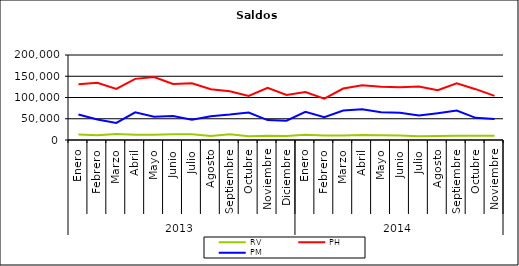
| Category | RV | PH | PM |
|---|---|---|---|
| 0 | 12966.437 | 131380.856 | 59975.653 |
| 1 | 11432.271 | 134655.891 | 48046.612 |
| 2 | 14149.543 | 120343.782 | 40297.909 |
| 3 | 12403.249 | 143830.507 | 64946.114 |
| 4 | 12323.134 | 148139.781 | 54592.514 |
| 5 | 13759.976 | 131634.752 | 56652.701 |
| 6 | 13256.014 | 133515.147 | 47907.561 |
| 7 | 9335.8 | 119600.732 | 55860.576 |
| 8 | 13362.811 | 114843.232 | 59771.51 |
| 9 | 9080.978 | 103607.627 | 64696.186 |
| 10 | 9993.913 | 122533.872 | 46801.148 |
| 11 | 9303.464 | 105747.395 | 45455.331 |
| 12 | 12145.055 | 112918.262 | 66200.17 |
| 13 | 10742.048 | 97242.789 | 53817.215 |
| 14 | 10795.854 | 121097.504 | 69409.543 |
| 15 | 11604.091 | 128798.176 | 72161.549 |
| 16 | 11264.83 | 125268.689 | 65570.493 |
| 17 | 10724.052 | 123922.82 | 64054.99 |
| 18 | 9051.652 | 126086.706 | 57402.892 |
| 19 | 9700.076 | 117038.593 | 63086.988 |
| 20 | 9709.733 | 133155.935 | 69429.611 |
| 21 | 10060.869 | 119576.756 | 52179.353 |
| 22 | 9755.94 | 103925.451 | 49698.972 |